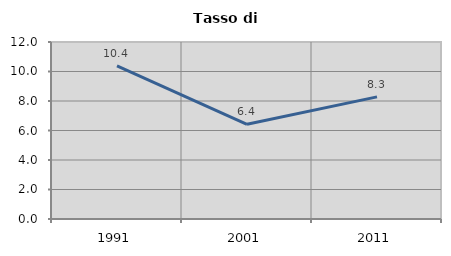
| Category | Tasso di disoccupazione   |
|---|---|
| 1991.0 | 10.383 |
| 2001.0 | 6.423 |
| 2011.0 | 8.281 |